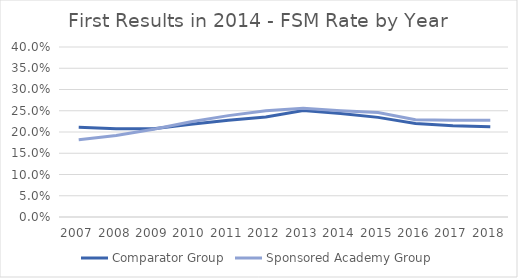
| Category | Comparator Group | Sponsored Academy Group |
|---|---|---|
| 2007.0 | 0.211 | 0.182 |
| 2008.0 | 0.207 | 0.192 |
| 2009.0 | 0.208 | 0.206 |
| 2010.0 | 0.218 | 0.224 |
| 2011.0 | 0.228 | 0.239 |
| 2012.0 | 0.235 | 0.25 |
| 2013.0 | 0.25 | 0.256 |
| 2014.0 | 0.243 | 0.25 |
| 2015.0 | 0.234 | 0.246 |
| 2016.0 | 0.22 | 0.229 |
| 2017.0 | 0.215 | 0.227 |
| 2018.0 | 0.212 | 0.228 |